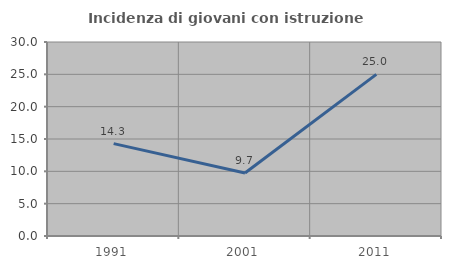
| Category | Incidenza di giovani con istruzione universitaria |
|---|---|
| 1991.0 | 14.286 |
| 2001.0 | 9.735 |
| 2011.0 | 25 |